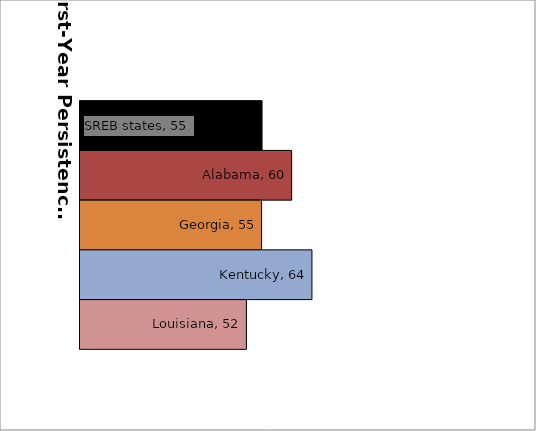
| Category | SREB states | Alabama | Georgia | Kentucky | Louisiana |
|---|---|---|---|---|---|
| 0 | 54.757 | 60.412 | 54.671 | 64.286 | 51.774 |